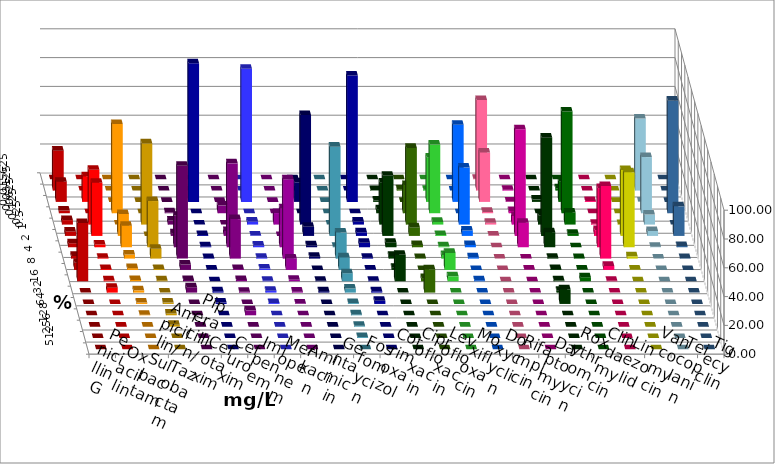
| Category | Penicillin G | Oxacillin | Ampicillin/ Sulbactam | Piperacillin/ Tazobactam | Cefotaxim | Cefuroxim | Imipenem | Meropenem | Amikacin | Gentamicin | Fosfomycin | Cotrimoxazol | Ciprofloxacin | Levofloxacin | Moxifloxacin | Doxycyclin | Rifampicin | Daptomycin | Roxythromycin | Clindamycin | Linezolid | Vancomycin | Teicoplanin | Tigecyclin |
|---|---|---|---|---|---|---|---|---|---|---|---|---|---|---|---|---|---|---|---|---|---|---|---|---|
| 0.015625 | 0 | 0 | 0 | 0 | 0 | 0 | 0 | 0 | 0 | 0 | 0 | 0 | 0 | 0 | 0 | 0 | 0.312 | 0 | 0 | 0 | 0 | 0 | 0 | 0 |
| 0.03125 | 27.726 | 0 | 0 | 0 | 0 | 0 | 0 | 0 | 0 | 0 | 0 | 0 | 0.312 | 0.935 | 0.623 | 0 | 62.928 | 0.631 | 0 | 1.562 | 0 | 0 | 0 | 50 |
| 0.0625 | 14.019 | 17.812 | 0 | 0 | 0 | 0 | 96.262 | 92.523 | 0 | 13.621 | 0 | 87.812 | 0.935 | 0 | 30.841 | 53.583 | 34.268 | 0.315 | 1.587 | 14.375 | 0.623 | 0 | 0 | 0.314 |
| 0.125 | 1.869 | 0 | 61.994 | 0 | 0.623 | 5.296 | 0 | 0 | 0 | 0 | 0 | 0 | 2.804 | 19.626 | 47.664 | 0 | 0.935 | 1.577 | 0 | 70.625 | 0 | 0 | 78.193 | 38.994 |
| 0.25 | 3.115 | 38.125 | 0 | 56.386 | 2.804 | 0 | 0 | 2.181 | 8 | 76.08 | 0 | 2.188 | 29.283 | 53.271 | 1.869 | 39.564 | 1.246 | 5.994 | 6.349 | 8.438 | 0.623 | 0.312 | 0 | 6.918 |
| 0.5 | 3.115 | 36.875 | 15.265 | 0 | 1.869 | 3.427 | 0.623 | 0.312 | 0 | 6.312 | 61.994 | 2.5 | 41.745 | 5.919 | 0.623 | 3.738 | 0.312 | 74.132 | 68.254 | 1.562 | 4.05 | 45.794 | 20.561 | 3.459 |
| 1.0 | 2.804 | 1.875 | 14.953 | 32.087 | 21.807 | 58.255 | 0.623 | 1.246 | 27 | 1.329 | 0.312 | 3.125 | 3.115 | 1.558 | 0.623 | 1.558 | 0 | 17.035 | 10.476 | 0 | 41.121 | 52.025 | 0.935 | 0.314 |
| 2.0 | 1.869 | 0.625 | 2.804 | 6.854 | 64.486 | 27.414 | 0.312 | 0.623 | 55 | 1.329 | 18.069 | 0.625 | 1.869 | 0.312 | 2.492 | 0.935 | 0 | 0 | 0.635 | 0.312 | 50.467 | 1.558 | 0.312 | 0 |
| 4.0 | 4.984 | 0.625 | 1.246 | 0.623 | 3.738 | 0.623 | 0.312 | 0.935 | 8 | 0 | 8.723 | 0.312 | 1.558 | 0 | 11.838 | 0 | 0 | 0.315 | 0.635 | 0.312 | 2.804 | 0.312 | 0 | 0 |
| 8.0 | 40.498 | 0.625 | 0.935 | 0.623 | 0.935 | 0.935 | 0 | 0.312 | 1 | 0.332 | 5.607 | 0.312 | 18.38 | 2.181 | 3.427 | 0.623 | 0 | 0 | 0.635 | 2.812 | 0.312 | 0 | 0 | 0 |
| 16.0 | 0 | 3.438 | 1.558 | 0 | 3.738 | 0.623 | 0.935 | 1.246 | 0.667 | 0.997 | 2.804 | 0.938 | 0 | 16.199 | 0 | 0 | 0 | 0 | 1.27 | 0 | 0 | 0 | 0 | 0 |
| 32.0 | 0 | 0 | 0.935 | 0.935 | 0 | 0 | 0.935 | 0.623 | 0.333 | 0 | 0.623 | 2.188 | 0 | 0 | 0 | 0 | 0 | 0 | 10.159 | 0 | 0 | 0 | 0 | 0 |
| 64.0 | 0 | 0 | 0.312 | 1.246 | 0 | 3.427 | 0 | 0 | 0 | 0 | 0.623 | 0 | 0 | 0 | 0 | 0 | 0 | 0 | 0 | 0 | 0 | 0 | 0 | 0 |
| 128.0 | 0 | 0 | 0 | 1.246 | 0 | 0 | 0 | 0 | 0 | 0 | 0.623 | 0 | 0 | 0 | 0 | 0 | 0 | 0 | 0 | 0 | 0 | 0 | 0 | 0 |
| 256.0 | 0 | 0 | 0 | 0 | 0 | 0 | 0 | 0 | 0 | 0 | 0.623 | 0 | 0 | 0 | 0 | 0 | 0 | 0 | 0 | 0 | 0 | 0 | 0 | 0 |
| 512.0 | 0 | 0 | 0 | 0 | 0 | 0 | 0 | 0 | 0 | 0 | 0 | 0 | 0 | 0 | 0 | 0 | 0 | 0 | 0 | 0 | 0 | 0 | 0 | 0 |